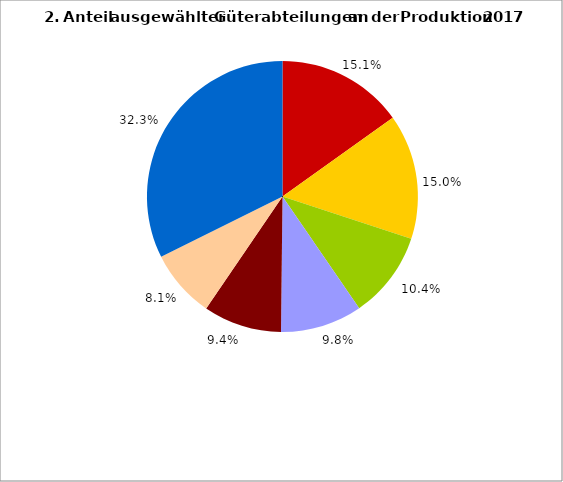
| Category | Series 0 |
|---|---|
| 0 | 15.119 |
| 1 | 14.943 |
| 2 | 10.365 |
| 3 | 9.753 |
| 4 | 9.345 |
| 5 | 8.137 |
| 6 | 32.338 |